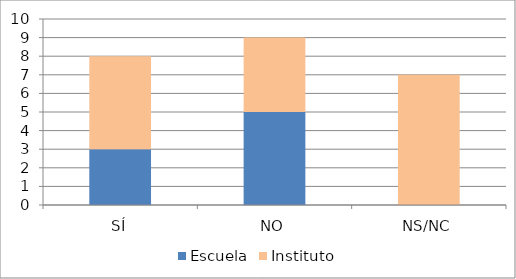
| Category | Escuela | Instituto |
|---|---|---|
| SÍ | 3 | 5 |
| NO | 5 | 4 |
| NS/NC | 0 | 7 |